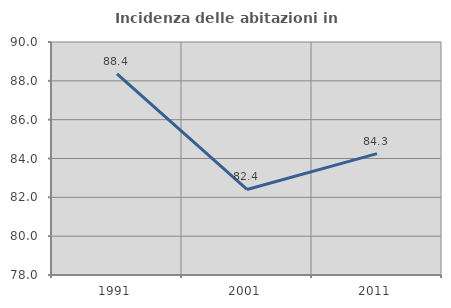
| Category | Incidenza delle abitazioni in proprietà  |
|---|---|
| 1991.0 | 88.358 |
| 2001.0 | 82.405 |
| 2011.0 | 84.252 |